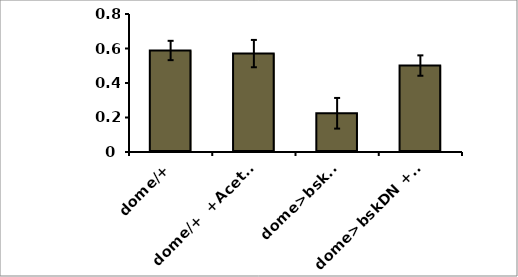
| Category | Series 0 |
|---|---|
| dome/+ | 0.588 |
| dome/+  +Acetate | 0.57 |
| dome>bskDN | 0.224 |
| dome>bskDN +Acetate | 0.501 |